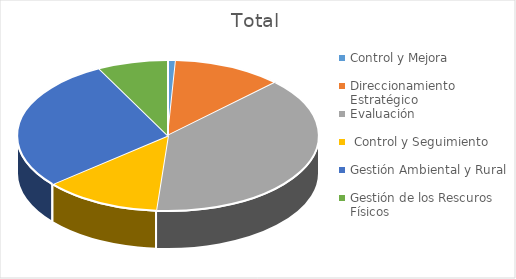
| Category | Total |
|---|---|
| Control y Mejora | 1 |
| Direccionamiento Estratégico | 14 |
| Evaluación, Control y Seguimiento | 46 |
| Gestión Ambiental y Rural | 15 |
| Gestión de los Rescuros Físicos | 34 |
| Planeación Ambiental | 9 |